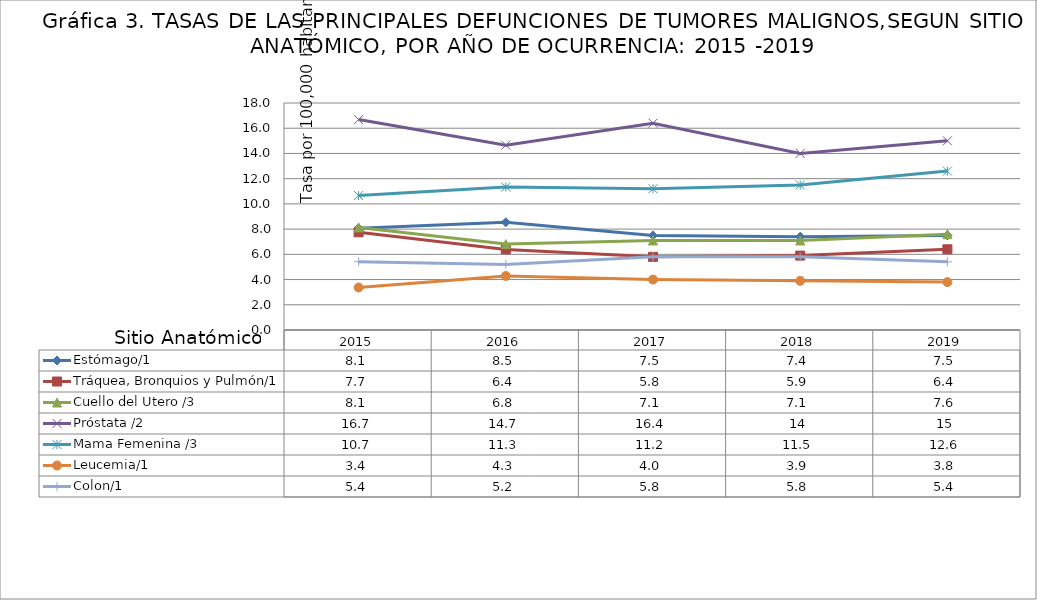
| Category | Estómago/1 | Tráquea, Bronquios y Pulmón/1 | Cuello del Utero /3 | Próstata /2 | Mama Femenina /3 | Leucemia/1 | Colon/1 |
|---|---|---|---|---|---|---|---|
| 2015.0 | 8.075 | 7.748 | 8.133 | 16.686 | 10.658 | 3.371 | 5.408 |
| 2016.0 | 8.546 | 6.391 | 6.813 | 14.659 | 11.338 | 4.285 | 5.202 |
| 2017.0 | 7.5 | 5.8 | 7.1 | 16.4 | 11.2 | 4 | 5.8 |
| 2018.0 | 7.4 | 5.9 | 7.1 | 14 | 11.5 | 3.9 | 5.8 |
| 2019.0 | 7.5 | 6.4 | 7.6 | 15 | 12.599 | 3.8 | 5.404 |